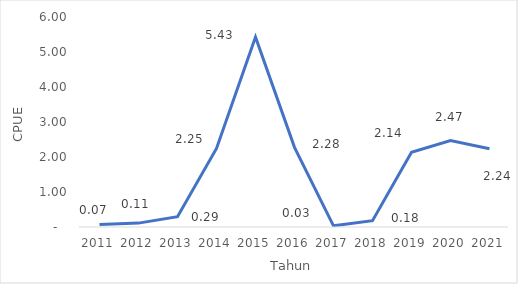
| Category | CPUE |
|---|---|
| 2011.0 | 0.07 |
| 2012.0 | 0.111 |
| 2013.0 | 0.295 |
| 2014.0 | 2.245 |
| 2015.0 | 5.426 |
| 2016.0 | 2.276 |
| 2017.0 | 0.034 |
| 2018.0 | 0.182 |
| 2019.0 | 2.137 |
| 2020.0 | 2.469 |
| 2021.0 | 2.236 |